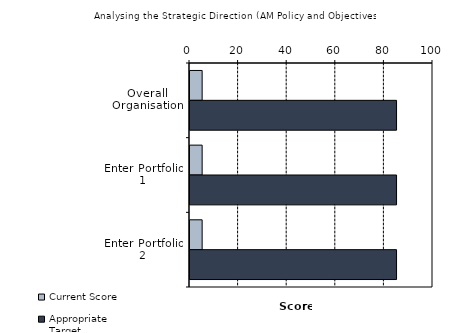
| Category | Current Score | Appropriate Target |
|---|---|---|
| Overall Organisation | 5 | 85 |
| Enter Portfolio 1 | 5 | 85 |
| Enter Portfolio 2 | 5 | 85 |